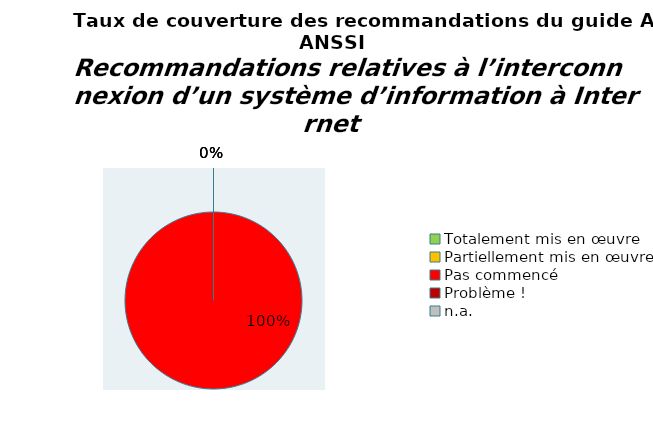
| Category | Series 0 |
|---|---|
| Totalement mis en œuvre | 0 |
| Partiellement mis en œuvre | 0 |
| Pas commencé | 55 |
| Problème ! | 0 |
| n.a. | 0 |